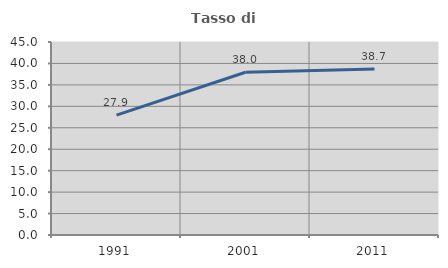
| Category | Tasso di occupazione   |
|---|---|
| 1991.0 | 27.943 |
| 2001.0 | 37.956 |
| 2011.0 | 38.728 |